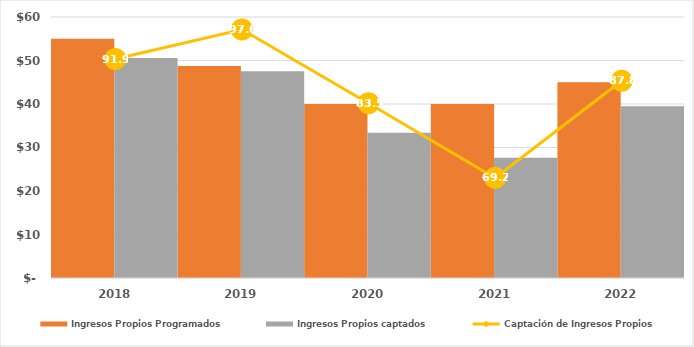
| Category | Ingresos Propios Programados | Ingresos Propios captados |
|---|---|---|
| 2018.0 | 55000 | 50568.585 |
| 2019.0 | 48713.575 | 47548.293 |
| 2020.0 | 40000 | 33390.085 |
| 2021.0 | 40000 | 27668.057 |
| 2022.0 | 45000 | 39503.967 |